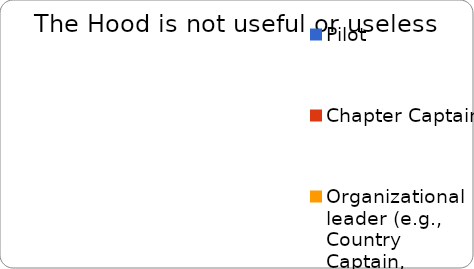
| Category | Neutral |
|---|---|
| Pilot | 0 |
| Chapter Captain | 0 |
| Organizational leader (e.g., Country Captain, member of The Hub) | 0 |